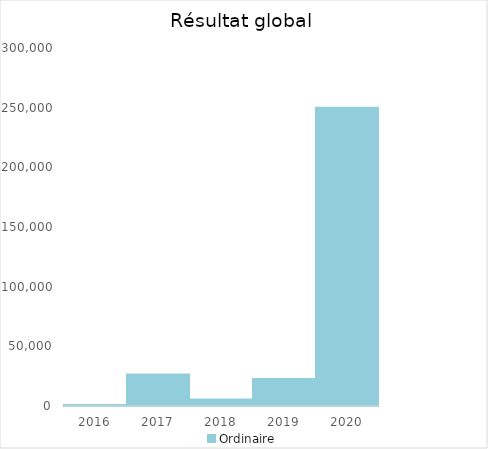
| Category |   | Ordinaire |    |
|---|---|---|---|
| 2016.0 |  | 845 |  |
| 2017.0 |  | 26332.7 |  |
| 2018.0 |  | 5454.98 |  |
| 2019.0 |  | 22549.55 |  |
| 2020.0 |  | 249998.12 |  |